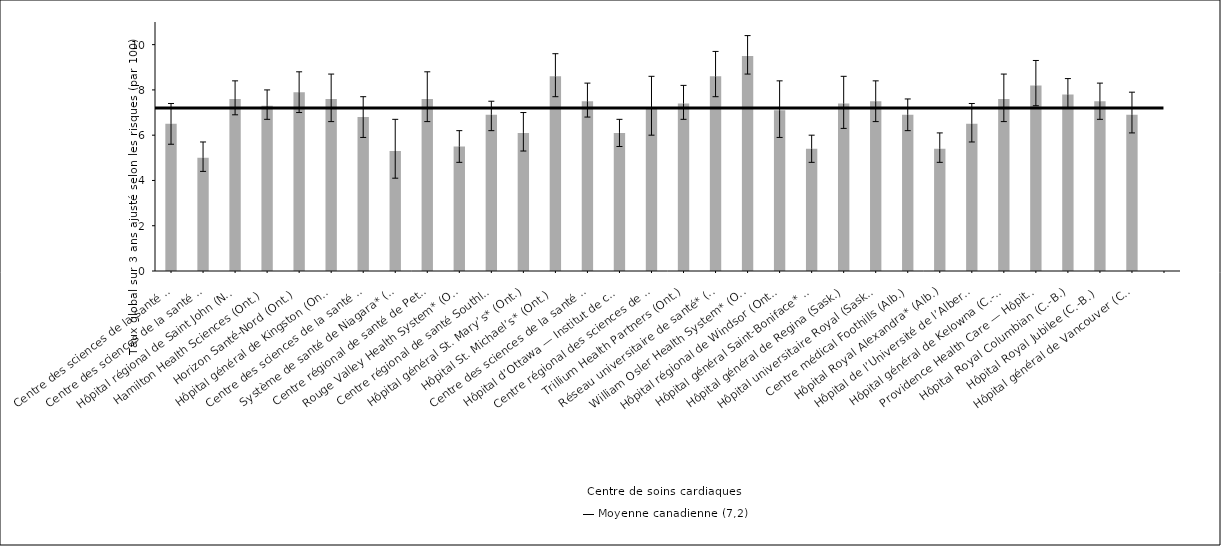
| Category | Taux ajusté selon les risques |
|---|---|
| Centre des sciences de la santé — St. John’s (T.-N.-L.) | 6.5 |
| Centre des sciences de la santé Queen Elizabeth II* (N.-É.) | 5 |
| Hôpital régional de Saint John (N.-B.) | 7.6 |
| Hamilton Health Sciences (Ont.) | 7.3 |
| Horizon Santé-Nord (Ont.) | 7.9 |
| Hôpital général de Kingston (Ont.) | 7.6 |
| Centre des sciences de la santé de London (Ont.) | 6.8 |
| Système de santé de Niagara* (Ont.) | 5.3 |
| Centre régional de santé de Peterborough (Ont.) | 7.6 |
| Rouge Valley Health System* (Ont.) | 5.5 |
| Centre régional de santé Southlake (Ont.) | 6.9 |
| Hôpital général St. Mary’s* (Ont.) | 6.1 |
| Hôpital St. Michael’s* (Ont.) | 8.6 |
| Centre des sciences de la santé Sunnybrook (Ont.) | 7.5 |
| Hôpital d’Ottawa — Institut de cardiologie de l’Université d’Ottawa* (Ont.) | 6.1 |
| Centre régional des sciences de la santé de Thunder Bay (Ont.) | 7.2 |
| Trillium Health Partners (Ont.) | 7.4 |
| Réseau universitaire de santé* (Ont.) | 8.6 |
| William Osler Health System* (Ont.) | 9.5 |
| Hôpital régional de Windsor (Ont.) | 7.1 |
| Hôpital général Saint-Boniface* (Man.) | 5.4 |
| Hôpital général de Regina (Sask.) | 7.4 |
| Hôpital universitaire Royal (Sask.) | 7.5 |
| Centre médical Foothills (Alb.) | 6.9 |
| Hôpital Royal Alexandra* (Alb.) | 5.4 |
| Hôpital de l’Université de l’Alberta (Alb.) | 6.5 |
| Hôpital général de Kelowna (C.-B.) | 7.6 |
| Providence Health Care — Hôpital St. Paul’s (Vancouver)* (C.-B.) | 8.2 |
| Hôpital Royal Columbian (C.-B.) | 7.8 |
| Hôpital Royal Jubilee (C.-B.) | 7.5 |
| Hôpital général de Vancouver (C.-B.) | 6.9 |